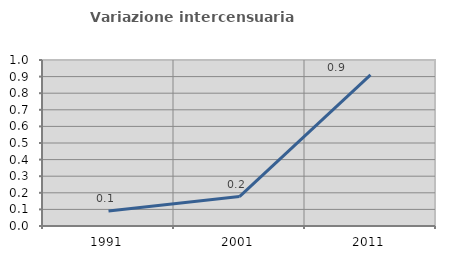
| Category | Variazione intercensuaria annua |
|---|---|
| 1991.0 | 0.091 |
| 2001.0 | 0.177 |
| 2011.0 | 0.911 |